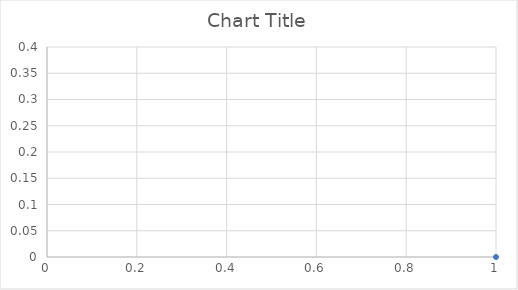
| Category | Series 0 |
|---|---|
| 0 | 0 |
| 1 | 0.033 |
| 2 | 0.065 |
| 3 | 0.099 |
| 4 | 0.133 |
| 5 | 0.167 |
| 6 | 0.209 |
| 7 | 0.246 |
| 8 | 0.28 |
| 9 | 0.315 |
| 10 | 0.345 |